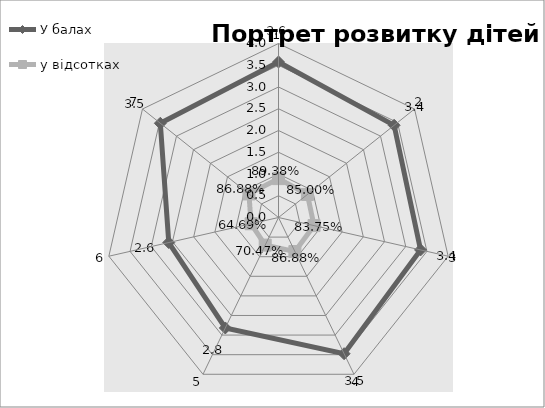
| Category | У балах  | у відсотках |
|---|---|---|
| 0 | 3.575 | 0.894 |
| 1 | 3.4 | 0.85 |
| 2 | 3.35 | 0.838 |
| 3 | 3.475 | 0.869 |
| 4 | 2.819 | 0.705 |
| 5 | 2.588 | 0.647 |
| 6 | 3.475 | 0.869 |